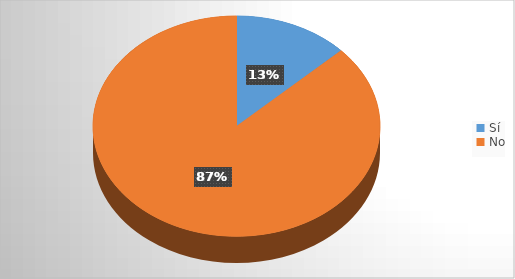
| Category | Series 0 |
|---|---|
| Sí | 153 |
| No | 1029 |